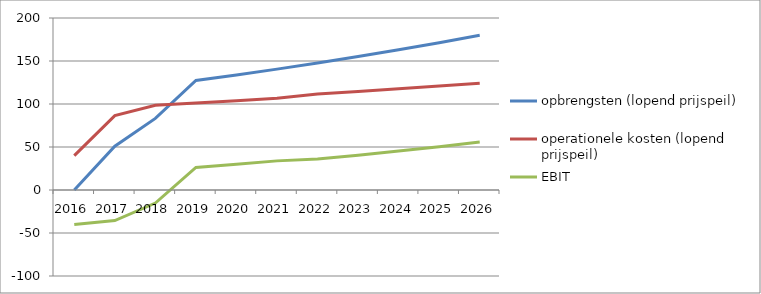
| Category | opbrengsten (lopend prijspeil) | operationele kosten (lopend prijspeil) | EBIT |
|---|---|---|---|
| 2016.0 | 0 | 40 | -40 |
| 2017.0 | 51 | 86.5 | -35.5 |
| 2018.0 | 83.232 | 98.434 | -15.202 |
| 2019.0 | 127.345 | 101.105 | 26.24 |
| 2020.0 | 133.789 | 103.856 | 29.933 |
| 2021.0 | 140.558 | 106.691 | 33.868 |
| 2022.0 | 147.671 | 111.611 | 36.06 |
| 2023.0 | 155.143 | 114.619 | 40.524 |
| 2024.0 | 162.993 | 117.718 | 45.275 |
| 2025.0 | 171.24 | 120.911 | 50.33 |
| 2026.0 | 179.905 | 124.2 | 55.705 |